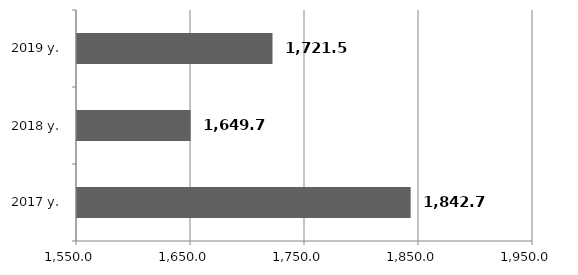
| Category | Series 0 |
|---|---|
| 2017 y. | 1842.7 |
| 2018 y. | 1649.7 |
| 2019 y. | 1721.5 |